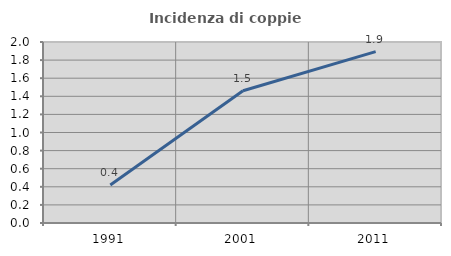
| Category | Incidenza di coppie miste |
|---|---|
| 1991.0 | 0.419 |
| 2001.0 | 1.461 |
| 2011.0 | 1.893 |